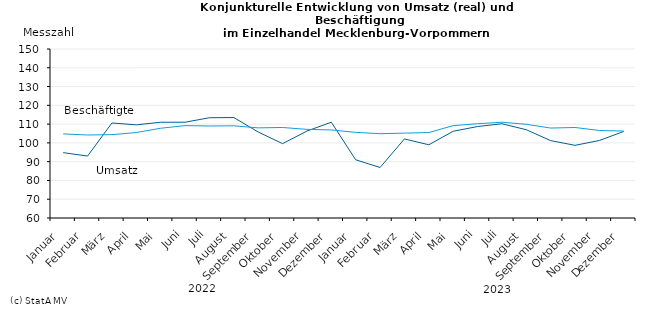
| Category | Umsatz | Beschäftigte |
|---|---|---|
|   Januar  | 94.8 | 104.8 |
|   Februar  | 93 | 104.2 |
|   März  | 110.6 | 104.4 |
|   April  | 109.6 | 105.5 |
|   Mai  | 111 | 107.8 |
|   Juni  | 111 | 109.2 |
|   Juli  | 113.4 | 109 |
|   August  | 113.5 | 109.1 |
|   September  | 105.8 | 108 |
|   Oktober  | 99.6 | 108.2 |
|   November  | 106.3 | 107.2 |
|   Dezember  | 111 | 106.9 |
|   Januar  | 91 | 105.6 |
|   Februar  | 86.9 | 104.9 |
|   März  | 102.1 | 105.2 |
|   April  | 99 | 105.5 |
|   Mai  | 106.2 | 109.2 |
|   Juni  | 108.7 | 110.2 |
|   Juli  | 110.2 | 111 |
|   August  | 107 | 109.9 |
|   September  | 101.2 | 107.9 |
|   Oktober  | 98.7 | 108.2 |
|   November  | 101.3 | 106.6 |
|   Dezember  | 106.1 | 106.3 |